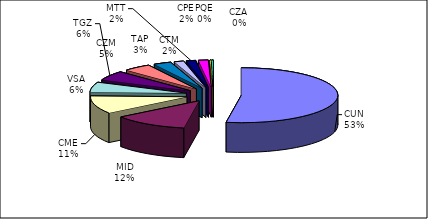
| Category | Series 0 |
|---|---|
| CUN | 183328 |
| MID | 43613 |
| CME | 36652 |
| VSA | 20820 |
| TGZ | 19564 |
| CZM | 16224 |
| TAP | 10307 |
| CTM | 5614 |
| MTT | 5451 |
| CPE | 5733 |
| PQE | 786 |
| CZA | 925 |